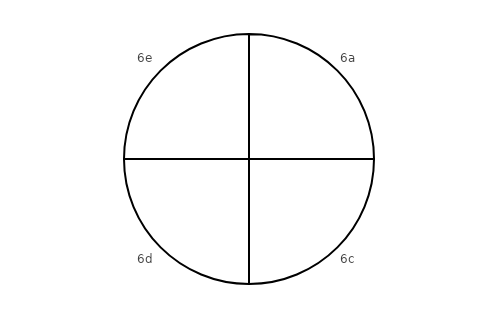
| Category | Sector weight |
|---|---|
| 6a | 1 |
| 6c | 1 |
| 6d | 1 |
| 6e | 1 |